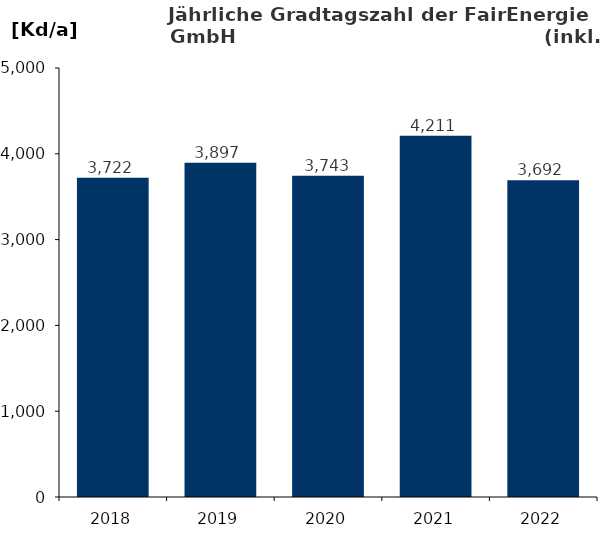
| Category | Gradtagszahl |
|---|---|
| 2018.0 | 3722.3 |
| 2019.0 | 3896.7 |
| 2020.0 | 3743 |
| 2021.0 | 4210.7 |
| 2022.0 | 3691.8 |